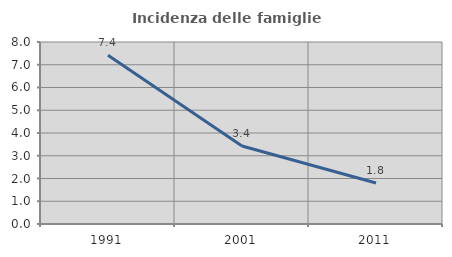
| Category | Incidenza delle famiglie numerose |
|---|---|
| 1991.0 | 7.414 |
| 2001.0 | 3.43 |
| 2011.0 | 1.8 |